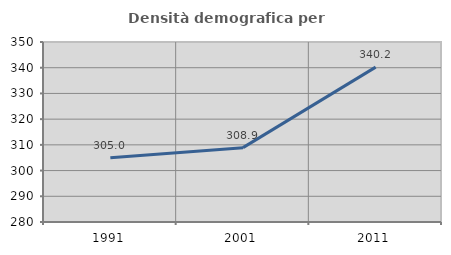
| Category | Densità demografica |
|---|---|
| 1991.0 | 304.993 |
| 2001.0 | 308.916 |
| 2011.0 | 340.223 |